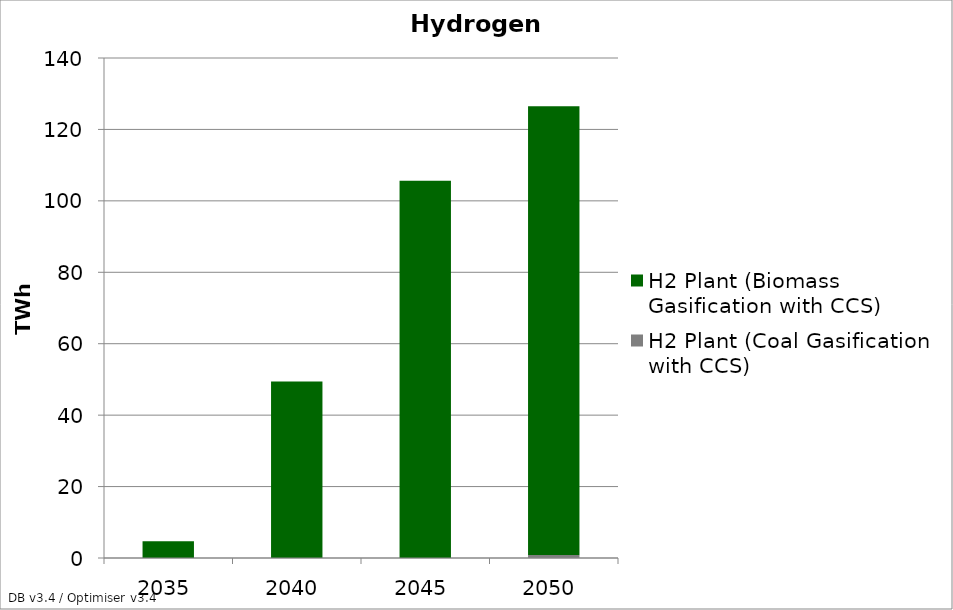
| Category | H2 Plant (Coal Gasification with CCS) | H2 Plant (Biomass Gasification with CCS) |
|---|---|---|
| 2035.0 | 0 | 4.667 |
| 2040.0 | 0 | 49.447 |
| 2045.0 | 0 | 105.636 |
| 2050.0 | 0.873 | 125.632 |